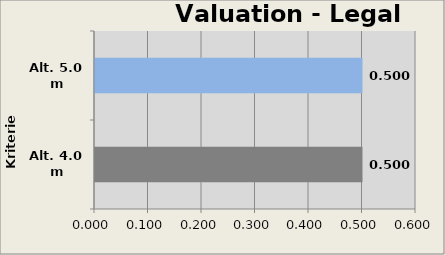
| Category | Valuation Legal Module  |
|---|---|
| Alt. 4.0 m | 0.5 |
| Alt. 5.0 m | 0.5 |